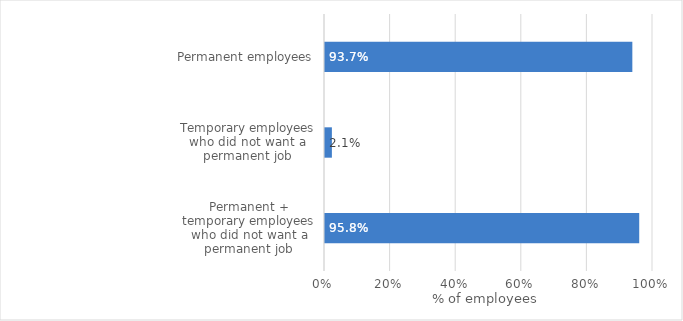
| Category | % of employees |
|---|---|
| Permanent + temporary employees who did not want a permanent job | 0.958 |
| Temporary employees who did not want a permanent job | 0.021 |
| Permanent employees | 0.937 |